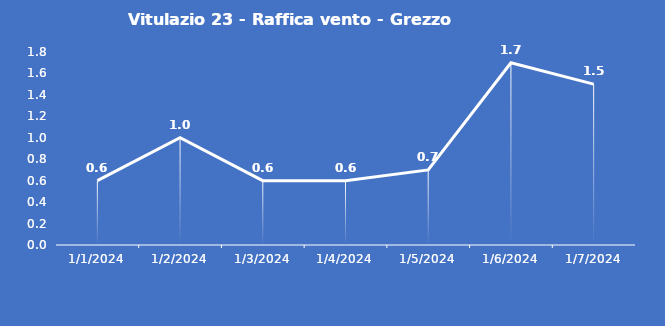
| Category | Vitulazio 23 - Raffica vento - Grezzo (m/s) |
|---|---|
| 1/1/24 | 0.6 |
| 1/2/24 | 1 |
| 1/3/24 | 0.6 |
| 1/4/24 | 0.6 |
| 1/5/24 | 0.7 |
| 1/6/24 | 1.7 |
| 1/7/24 | 1.5 |